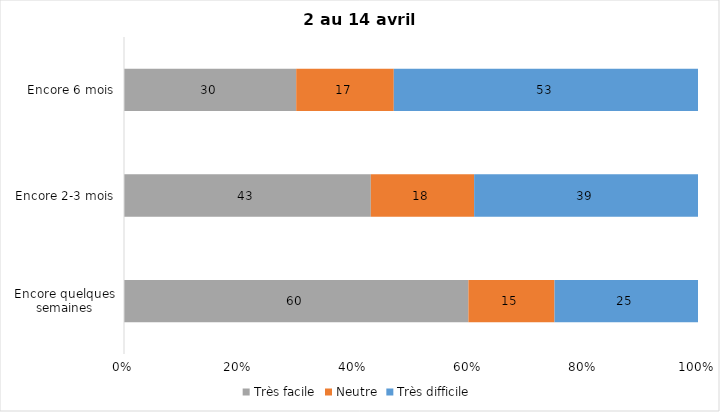
| Category | Très facile | Neutre | Très difficile |
|---|---|---|---|
| Encore quelques semaines | 60 | 15 | 25 |
| Encore 2-3 mois | 43 | 18 | 39 |
| Encore 6 mois | 30 | 17 | 53 |